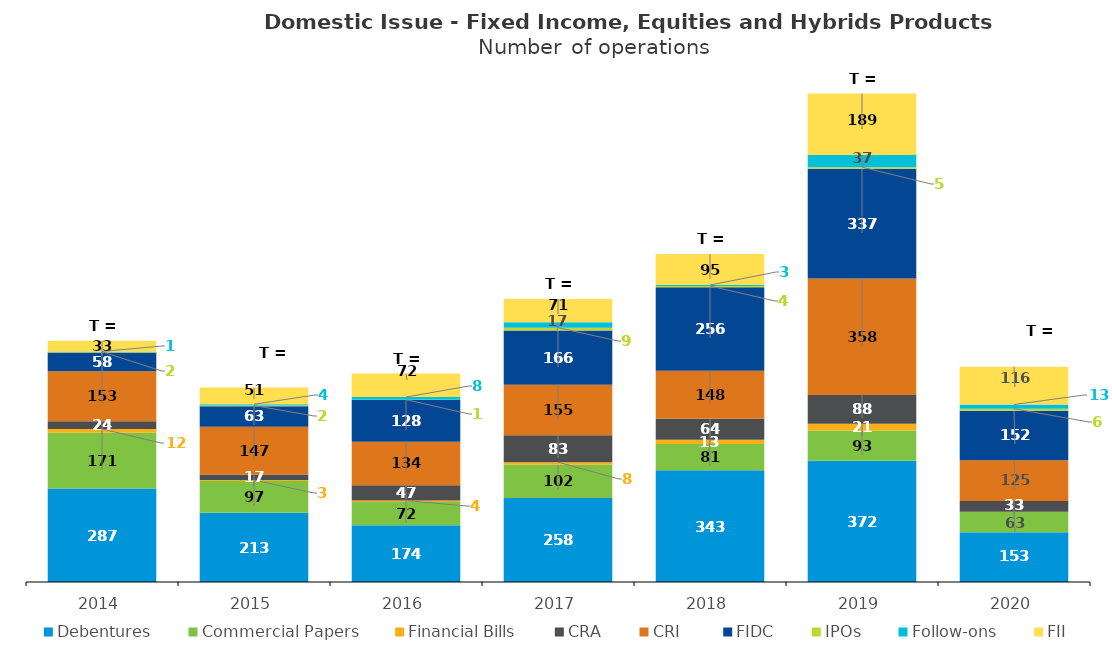
| Category | Debentures | Commercial Papers | Financial Bills | CRA | CRI  | FIDC | IPOs | Follow-ons | FII |
|---|---|---|---|---|---|---|---|---|---|
| 2014.0 | 287 | 171 | 12 | 24 | 153 | 58 | 2 | 1 | 33 |
| 2015.0 | 213 | 97 | 3 | 17 | 147 | 63 | 2 | 4 | 51 |
| 2016.0 | 174 | 72 | 4 | 47 | 134 | 128 | 1 | 8 | 72 |
| 2017.0 | 258 | 102 | 8 | 83 | 155 | 166 | 9 | 17 | 71 |
| 2018.0 | 343 | 81 | 13 | 64 | 148 | 256 | 4 | 3 | 95 |
| 2019.0 | 372 | 93 | 21 | 88 | 358 | 337 | 5 | 37 | 189 |
| 2020.0 | 153 | 63 | 0 | 33 | 125 | 152 | 6 | 13 | 116 |